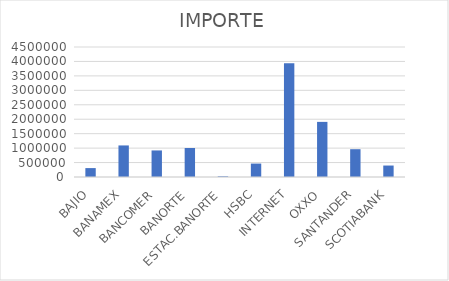
| Category | IMPORTE |
|---|---|
| BAJIO | 308294.33 |
| BANAMEX | 1092538.17 |
| BANCOMER | 919375 |
| BANORTE | 1003556.03 |
| ESTAC.BANORTE | 24416 |
| HSBC | 464758.26 |
| INTERNET | 3941280.46 |
| OXXO | 1908018.19 |
| SANTANDER | 962218.34 |
| SCOTIABANK | 396735.28 |